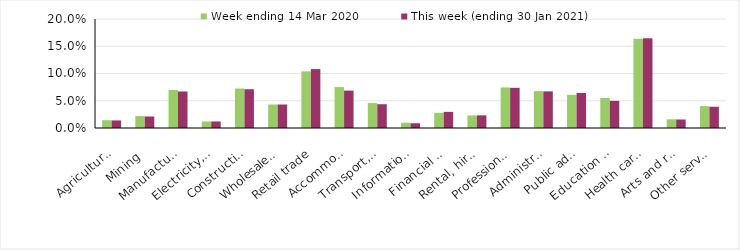
| Category | Week ending 14 Mar 2020 | This week (ending 30 Jan 2021) |
|---|---|---|
| Agriculture, forestry and fishing | 0.014 | 0.014 |
| Mining | 0.022 | 0.021 |
| Manufacturing | 0.07 | 0.067 |
| Electricity, gas, water and waste services | 0.012 | 0.012 |
| Construction | 0.072 | 0.071 |
| Wholesale trade | 0.043 | 0.043 |
| Retail trade | 0.104 | 0.108 |
| Accommodation and food services | 0.075 | 0.069 |
| Transport, postal and warehousing | 0.046 | 0.044 |
| Information media and telecommunications | 0.01 | 0.009 |
| Financial and insurance services | 0.028 | 0.03 |
| Rental, hiring and real estate services | 0.023 | 0.023 |
| Professional, scientific and technical services | 0.074 | 0.074 |
| Administrative and support services | 0.068 | 0.067 |
| Public administration and safety | 0.061 | 0.064 |
| Education and training | 0.055 | 0.05 |
| Health care and social assistance | 0.164 | 0.165 |
| Arts and recreation services | 0.016 | 0.016 |
| Other services | 0.04 | 0.039 |